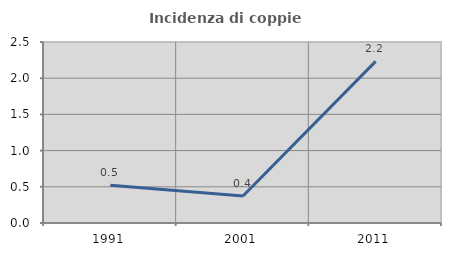
| Category | Incidenza di coppie miste |
|---|---|
| 1991.0 | 0.522 |
| 2001.0 | 0.373 |
| 2011.0 | 2.233 |